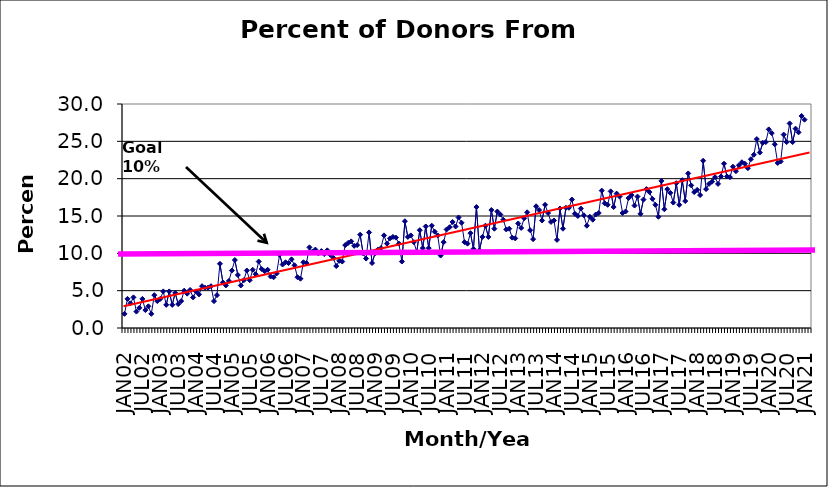
| Category | Series 0 |
|---|---|
| JAN02 | 1.9 |
| FEB02 | 3.9 |
| MAR02 | 3.3 |
| APR02 | 4.1 |
| MAY02 | 2.2 |
| JUN02 | 2.7 |
| JUL02 | 3.9 |
| AUG02 | 2.4 |
| SEP02 | 2.9 |
| OCT02 | 1.9 |
| NOV02 | 4.4 |
| DEC02 | 3.6 |
| JAN03 | 3.9 |
| FEB03 | 4.9 |
| MAR03 | 3.1 |
| APR03 | 4.9 |
| MAY03 | 3.1 |
| JUN03 | 4.7 |
| JUL03 | 3.2 |
| AUG03 | 3.6 |
| SEP03 | 5 |
| OCT03 | 4.6 |
| NOV03 | 5.1 |
| DEC03 | 4.1 |
| JAN04 | 4.9 |
| FEB04 | 4.5 |
| MAR04 | 5.6 |
| APR04 | 5.4 |
| MAY04 | 5.4 |
| JUN04 | 5.6 |
| JUL04 | 3.6 |
| AUG04 | 4.4 |
| SEP04 | 8.6 |
| OCT04 | 6.1 |
| NOV04 | 5.7 |
| DEC04 | 6.3 |
| JAN05 | 7.7 |
| FEB05 | 9.1 |
| MAR05 | 7.1 |
| APR05 | 5.7 |
| MAY05 | 6.4 |
| JUN05 | 7.7 |
| JUL05 | 6.4 |
| AUG05 | 7.8 |
| SEP05 | 7.2 |
| OCT05 | 8.9 |
| NOV05 | 7.9 |
| DEC05 | 7.6 |
| JAN06 | 7.8 |
| FEB06 | 6.9 |
| MAR06 | 6.8 |
| APR06 | 7.3 |
| MAY06 | 9.8 |
| JUN06 | 8.5 |
| JUL06 | 8.8 |
| AUG06 | 8.7 |
| SEP06 | 9.2 |
| OCT06 | 8.4 |
| NOV06 | 6.8 |
| DEC06 | 6.6 |
| JAN07 | 8.8 |
| FEB07 | 8.7 |
| MAR07 | 10.8 |
| APR07 | 10.2 |
| MAY07 | 10.5 |
| JUN07 | 10 |
| JUL07 | 10.3 |
| AUG07 | 9.9 |
| SEP07 | 10.4 |
| OCT07 | 9.8 |
| NOV07 | 9.4 |
| DEC07 | 8.3 |
| JAN08 | 9 |
| FEB08 | 8.9 |
| MAR08 | 11.1 |
| APR08 | 11.4 |
| MAY08 | 11.6 |
| JUN08 | 11 |
| JUL08 | 11.1 |
| AUG08 | 12.5 |
| SEP08 | 10 |
| OCT08 | 9.3 |
| NOV08 | 12.8 |
| DEC08 | 8.7 |
| JAN09 | 10 |
| FEB09 | 10.5 |
| MAR09 | 10.7 |
| APR09 | 12.4 |
| MAY09 | 11.3 |
| JUN09 | 12 |
| JUL09 | 12.2 |
| AUG09 | 12.1 |
| SEP09 | 11.3 |
| OCT09 | 8.9 |
| NOV09 | 14.3 |
| DEC09 | 12.2 |
| JAN10 | 12.4 |
| FEB10 | 11.5 |
| MAR10 | 10.2 |
| APR10 | 13.1 |
| MAY10 | 10.7 |
| JUN10 | 13.6 |
| JUL10 | 10.7 |
| AUG10 | 13.7 |
| SEP10 | 12.9 |
| OCT10 | 12.4 |
| NOV10 | 9.7 |
| DEC10 | 11.5 |
| JAN11 | 13.2 |
| FEB11 | 13.5 |
| MAR11 | 14.2 |
| APR11 | 13.6 |
| MAY11 | 14.8 |
| JUN11 | 14.1 |
| JUL11 | 11.5 |
| AUG11 | 11.3 |
| SEP11 | 12.7 |
| OCT11 | 10.6 |
| NOV11 | 16.2 |
| DEC11 | 10.4 |
| JAN12 | 12.2 |
| FEB12 | 13.7 |
| MAR12 | 12.2 |
| APR12 | 15.8 |
| MAY12 | 13.3 |
| JUN12 | 15.6 |
| JUL12 | 15.2 |
| AUG12 | 14.5 |
| SEP12 | 13.2 |
| OCT12 | 13.3 |
| NOV12 | 12.1 |
| DEC12 | 12 |
| JAN13 | 14 |
| FEB13 | 13.4 |
| MAR13 | 14.7 |
| APR13 | 15.5 |
| MAY13 | 13.1 |
| JUN13 | 11.9 |
| JUL13 | 16.3 |
| AUG13 | 15.8 |
| SEP13 | 14.4 |
| OCT13 | 16.5 |
| NOV13 | 15.4 |
| DEC13 | 14.2 |
| JAN14 | 14.4 |
| FEB14 | 11.8 |
| MAR14 | 16 |
| APR14 | 13.3 |
| MAY14 | 16.1 |
| JUN14 | 16.1 |
| JUL14 | 17.2 |
| AUG14 | 15.3 |
| SEP14 | 15 |
| OCT14 | 16 |
| NOV14 | 15.1 |
| DEC14 | 13.7 |
| JAN15 | 14.9 |
| FEB15 | 14.5 |
| MAR15 | 15.2 |
| APR15 | 15.4 |
| MAY15 | 18.4 |
| JUN15 | 16.7 |
| JUL15 | 16.5 |
| AUG15 | 18.3 |
| SEP15 | 16.2 |
| OCT15 | 18 |
| NOV15 | 17.6 |
| DEC15 | 15.4 |
| JAN16 | 15.6 |
| FEB16 | 17.4 |
| MAR16 | 17.8 |
| APR16 | 16.4 |
| MAY16 | 17.6 |
| JUN16 | 15.3 |
| JUL16 | 17.2 |
| AUG16 | 18.6 |
| SEP16 | 18.2 |
| OCT16 | 17.3 |
| NOV16 | 16.5 |
| DEC16 | 14.9 |
| JAN17 | 19.7 |
| FEB17 | 15.9 |
| MAR17 | 18.6 |
| APR17 | 18.1 |
| MAY17 | 16.8 |
| JUN17 | 19.4 |
| JUL17 | 16.5 |
| AUG17 | 19.8 |
| SEP17 | 17 |
| OCT17 | 20.7 |
| NOV17 | 19.1 |
| DEC17 | 18.2 |
| JAN18 | 18.5 |
| FEB18 | 17.8 |
| MAR18 | 22.4 |
| APR18 | 18.6 |
| MAY18 | 19.3 |
| JUN18 | 19.6 |
| JUL18 | 20.2 |
| AUG18 | 19.3 |
| SEP18 | 20.3 |
| OCT18 | 22 |
| NOV18 | 20.3 |
| DEC18 | 20.2 |
| JAN19 | 21.6 |
| FEB19 | 21 |
| MAR19 | 21.8 |
| APR19 | 22.2 |
| MAY19 | 22 |
| JUN19 | 21.4 |
| JUL19 | 22.6 |
| AUG19 | 23.2 |
| SEP19 | 25.3 |
| OCT19 | 23.5 |
| NOV19 | 24.8 |
| DEC19 | 24.9 |
| JAN20 | 26.6 |
| FEB20 | 26.1 |
| MAR20 | 24.6 |
| APR20 | 22.1 |
| MAY20 | 22.3 |
| JUN20 | 25.9 |
| JUL20 | 24.9 |
| AUG20 | 27.4 |
| SEP20 | 24.9 |
| OCT20 | 26.7 |
| NOV20 | 26.2 |
| DEC20 | 28.4 |
| JAN21 | 27.9 |